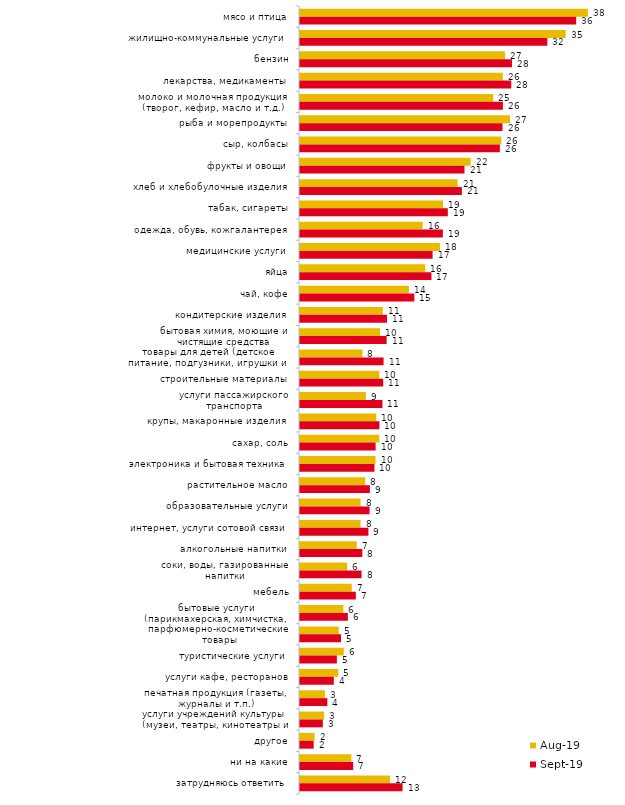
| Category | авг.19 | сен.19 |
|---|---|---|
| мясо и птица | 37.512 | 35.99 |
| жилищно-коммунальные услуги | 34.615 | 32.228 |
| бензин | 26.723 | 27.624 |
| лекарства, медикаменты | 26.424 | 27.525 |
| молоко и молочная продукция (творог, кефир, масло и т.д.) | 25.175 | 26.436 |
| рыба и морепродукты | 27.373 | 26.386 |
| сыр, колбасы | 26.224 | 26.04 |
| фрукты и овощи | 22.228 | 21.436 |
| хлеб и хлебобулочные изделия | 20.529 | 21.089 |
| табак, сигареты | 18.631 | 19.257 |
| одежда, обувь, кожгалантерея | 15.984 | 18.614 |
| медицинские услуги | 18.232 | 17.277 |
| яйца | 16.334 | 17.129 |
| чай, кофе | 14.186 | 14.901 |
| кондитерские изделия | 10.789 | 11.337 |
| бытовая химия, моющие и чистящие средства | 10.44 | 11.287 |
| товары для детей (детское питание, подгузники, игрушки и т.п.) | 8.142 | 10.891 |
| строительные материалы | 10.34 | 10.842 |
| услуги пассажирского транспорта | 8.591 | 10.743 |
| крупы, макаронные изделия | 9.94 | 10.347 |
| сахар, соль | 10.34 | 9.851 |
| электроника и бытовая техника | 9.84 | 9.703 |
| растительное масло | 8.492 | 9.109 |
| образовательные услуги | 7.892 | 9.059 |
| интернет, услуги сотовой связи | 7.892 | 8.911 |
| алкогольные напитки | 7.393 | 8.119 |
| соки, воды, газированные напитки | 6.144 | 8.02 |
| мебель | 6.743 | 7.277 |
| бытовые услуги (парикмахерская, химчистка, ателье и т.д.) | 5.644 | 6.238 |
| парфюмерно-косметические товары | 5.045 | 5.347 |
| туристические услуги | 5.694 | 4.802 |
| услуги кафе, ресторанов | 4.995 | 4.406 |
| печатная продукция (газеты, журналы и т.п.) | 3.247 | 3.564 |
| услуги учреждений культуры (музеи, театры, кинотеатры и т.п.) | 3.147 | 2.97 |
| другое | 1.898 | 1.782 |
| ни на какие | 6.693 | 6.931 |
| затрудняюсь ответить | 11.738 | 13.366 |